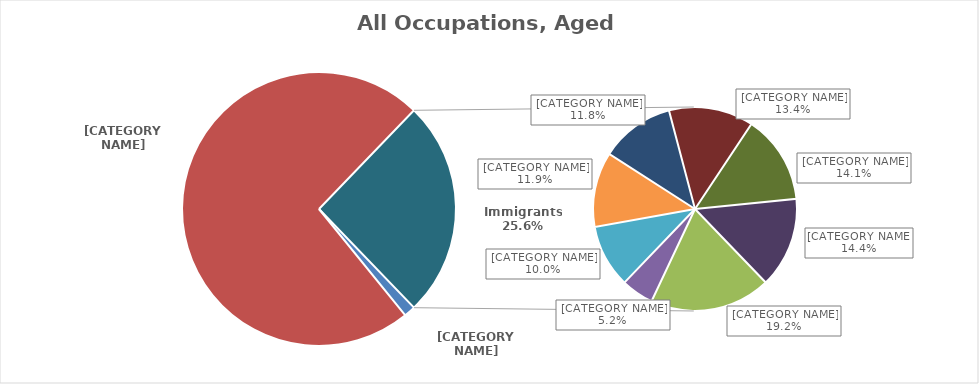
| Category | Series 0 |
|---|---|
|   Non-permanent residents | 229250 |
|   Non-immigrants | 12398280 |
|     Before 1981 | 834625 |
|     1981 to 1985 | 224365 |
|     1986 to 1990 | 434610 |
|     1991 to 1995 | 517810 |
|     1996 to 2000 | 513140 |
|     2001 to 2005 | 583750 |
|     2006 to 2010 | 611775 |
|     2011 to 2016 | 625860 |